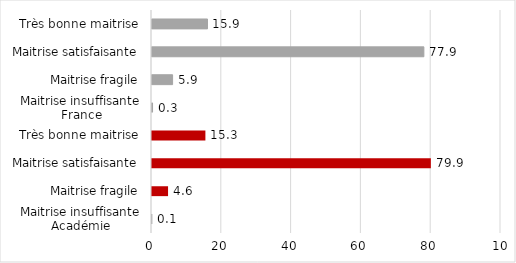
| Category | Series 0 |
|---|---|
| 0 | 0.1 |
| 1 | 4.6 |
| 2 | 79.9 |
| 3 | 15.3 |
| 4 | 0.3 |
| 5 | 5.9 |
| 6 | 77.9 |
| 7 | 15.9 |